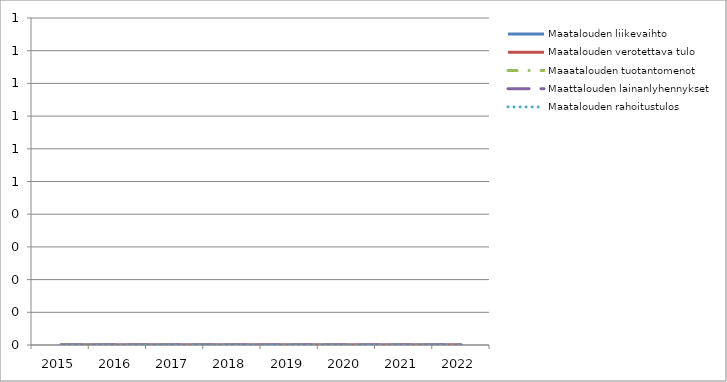
| Category | Maatalouden liikevaihto | Maatalouden verotettava tulo | Maaatalouden tuotantomenot | Maattalouden lainanlyhennykset | Maatalouden rahoitustulos |
|---|---|---|---|---|---|
| 2015.0 | 0 | 0 | 0 | 0 | 0 |
| 2016.0 | 0 | 0 | 0 | 0 | 0 |
| 2017.0 | 0 | 0 | 0 | 0 | 0 |
| 2018.0 | 0 | 0 | 0 | 0 | 0 |
| 2019.0 | 0 | 0 | 0 | 0 | 0 |
| 2020.0 | 0 | 0 | 0 | 0 | 0 |
| 2021.0 | 0 | 0 | 0 | 0 | 0 |
| 2022.0 | 0 | 0 | 0 | 0 | 0 |